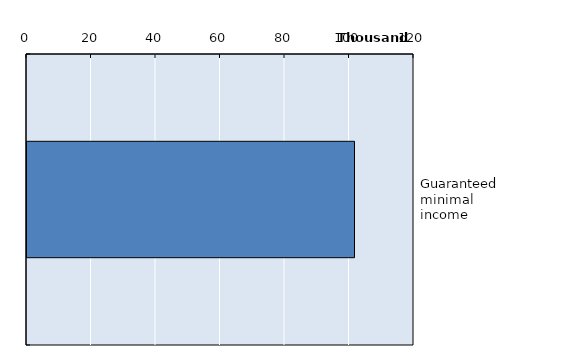
| Category | Series 0 |
|---|---|
| Guaranteed minimal income | 101551 |